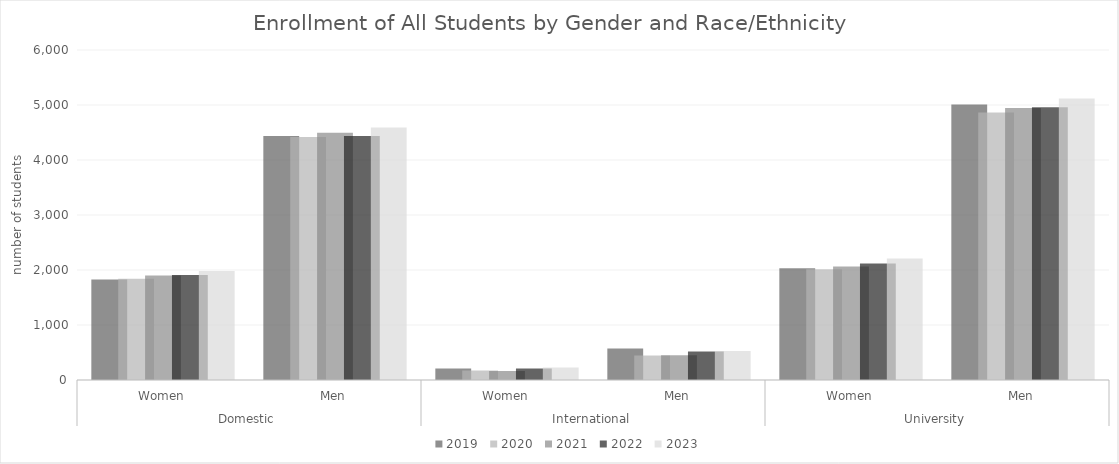
| Category | 2019  | 2020  | 2021  | 2022  | 2023  |
|---|---|---|---|---|---|
| 0 | 1826 | 1839 | 1900 | 1910 | 1981 |
| 1 | 4435 | 4416 | 4496 | 4438 | 4589 |
| 2 | 207 | 174 | 163 | 207 | 227 |
| 3 | 573 | 446 | 450 | 519 | 527 |
| 4 | 2033 | 2013 | 2063 | 2117 | 2208 |
| 5 | 5008 | 4862 | 4946 | 4957 | 5116 |